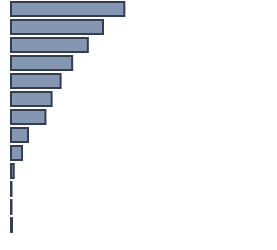
| Category | Series 0 |
|---|---|
| 0 | 44.1 |
| 1 | 35.8 |
| 2 | 29.9 |
| 3 | 23.8 |
| 4 | 19.3 |
| 5 | 15.8 |
| 6 | 13.4 |
| 7 | 6.6 |
| 8 | 4.3 |
| 9 | 1.1 |
| 10 | 0.2 |
| 11 | 0.2 |
| 12 | 0.4 |